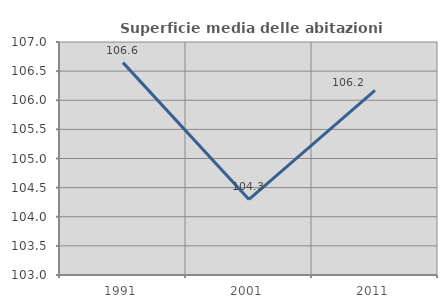
| Category | Superficie media delle abitazioni occupate |
|---|---|
| 1991.0 | 106.646 |
| 2001.0 | 104.298 |
| 2011.0 | 106.168 |